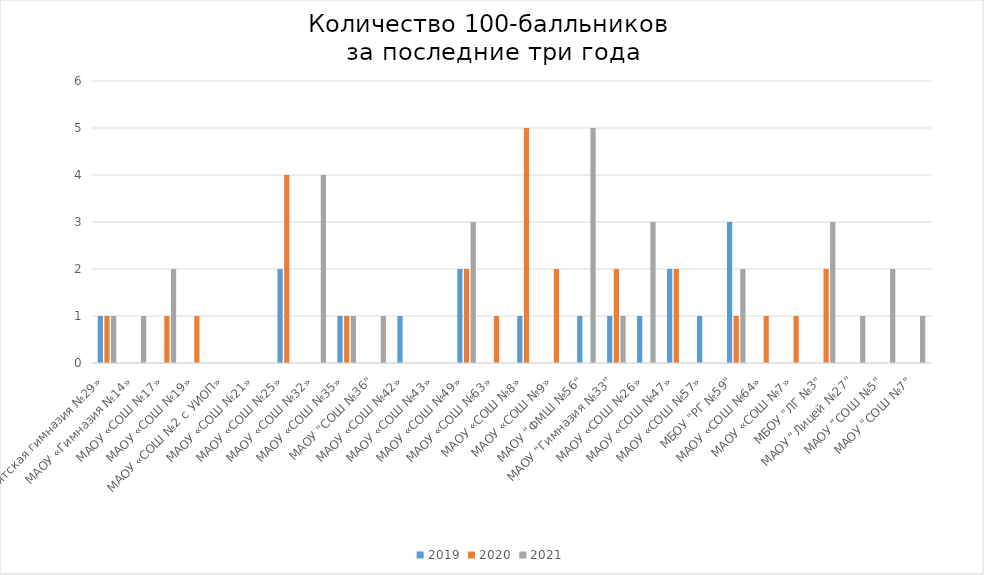
| Category | 2019 | 2020 | 2021 |
|---|---|---|---|
| МАОУ «Бурятская гимназия №29» | 1 | 1 | 1 |
| МАОУ «Гимназия №14» | 0 | 0 | 1 |
| МАОУ «СОШ №17» | 0 | 1 | 2 |
| МАОУ «СОШ №19» | 0 | 1 | 0 |
| МАОУ «СОШ №2 с УИОП» | 0 | 0 | 0 |
| МАОУ «СОШ №21» | 0 | 0 | 0 |
| МАОУ «СОШ №25» | 2 | 4 | 0 |
| МАОУ «СОШ №32» | 0 | 0 | 4 |
| МАОУ «СОШ №35» | 1 | 1 | 1 |
| МАОУ "СОШ №36" | 0 | 0 | 1 |
| МАОУ «СОШ №42» | 1 | 0 | 0 |
| МАОУ «СОШ №43» | 0 | 0 | 0 |
| МАОУ «СОШ №49» | 2 | 2 | 3 |
| МАОУ «СОШ №63» | 0 | 1 | 0 |
| МАОУ «СОШ №8» | 1 | 5 | 0 |
| МАОУ «СОШ №9» | 0 | 2 | 0 |
| МАОУ "ФМШ №56" | 1 | 0 | 5 |
| МАОУ "Гимназия №33" | 1 | 2 | 1 |
| МАОУ «СОШ №26» | 1 | 0 | 3 |
| МАОУ «СОШ №47» | 2 | 2 | 0 |
| МАОУ «СОШ №57» | 1 | 0 | 0 |
| МБОУ "РГ №59" | 3 | 1 | 2 |
| МАОУ «СОШ №64» | 0 | 1 | 0 |
| МАОУ «СОШ №7» | 0 | 1 | 0 |
| МБОУ "ЛГ №3" | 0 | 2 | 3 |
| МАОУ "Лицей №27" | 0 | 0 | 1 |
| МАОУ "СОШ №5" | 0 | 0 | 2 |
| МАОУ "СОШ №7" | 0 | 0 | 1 |